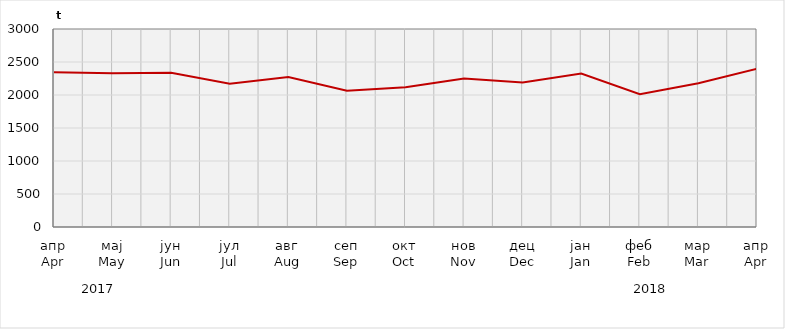
| Category | Нето тежина заклане стоке                              Net weight of  slaughtered livestock |
|---|---|
| апр
Apr | 2344899.97 |
| мај
May | 2330965.85 |
| јун
Jun | 2337255.83 |
| јул
Jul | 2169976.6 |
| авг
Aug | 2273238.2 |
| сеп
Sep | 2066000 |
| окт
Oct | 2118775.52 |
| нов
Nov | 2248639.95 |
| дец
Dec | 2190874.83 |
| јан
Jan | 2324971.47 |
| феб
Feb | 2010400 |
| мар
Mar | 2177800 |
| апр
Apr | 2398200 |